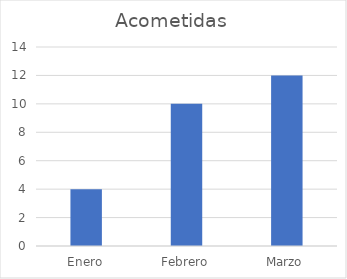
| Category | Acometidas |
|---|---|
| Enero | 4 |
| Febrero | 10 |
| Marzo | 12 |